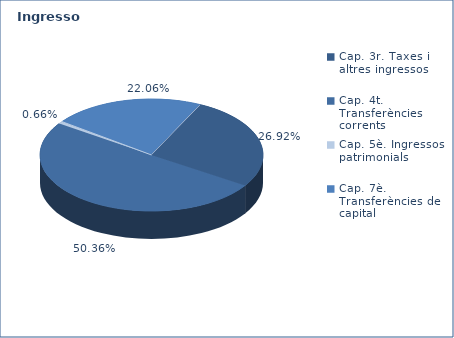
| Category | Series 0 |
|---|---|
| Cap. 3r. Taxes i altres ingressos | 83592727 |
| Cap. 4t. Transferències corrents | 156363310 |
| Cap. 5è. Ingressos patrimonials | 2040822 |
| Cap. 7è. Transferències de capital | 68507770 |
| Cap. 8è. Actius financers | 0 |
| Cap. 9è. Préstecs | 0 |